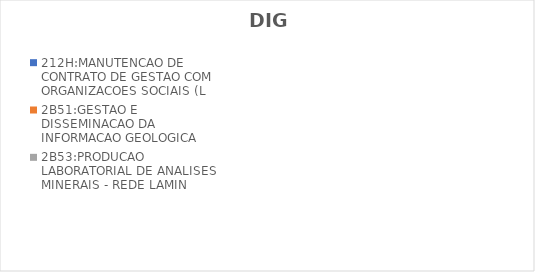
| Category | 212H:MANUTENCAO DE CONTRATO DE GESTAO COM ORGANIZACOES SOCIAIS (L | 2B51:GESTAO E DISSEMINACAO DA INFORMACAO GEOLOGICA | 2B53:PRODUCAO LABORATORIAL DE ANALISES MINERAIS - REDE LAMIN |
|---|---|---|---|
| EXECUTADO | 0 | 0.717 | 0.339 |